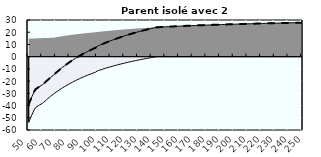
| Category | Coin fiscal moyen (somme des composantes) | Taux moyen d'imposition net en % du salaire brut |
|---|---|---|
| 50.0 | -38.941 | -38.941 |
| 51.0 | -36.217 | -36.217 |
| 52.0 | -33.598 | -33.598 |
| 53.0 | -31.077 | -31.077 |
| 54.0 | -28.65 | -28.65 |
| 55.0 | -26.685 | -26.685 |
| 56.0 | -25.896 | -25.896 |
| 57.0 | -25.134 | -25.134 |
| 58.0 | -24.399 | -24.399 |
| 59.0 | -23.689 | -23.689 |
| 60.0 | -23.003 | -23.003 |
| 61.0 | -22.114 | -22.114 |
| 62.0 | -21.039 | -21.039 |
| 63.0 | -19.999 | -19.999 |
| 64.0 | -18.991 | -18.991 |
| 65.0 | -18.014 | -18.014 |
| 66.0 | -17.067 | -17.067 |
| 67.0 | -16.148 | -16.148 |
| 68.0 | -15.256 | -15.256 |
| 69.0 | -14.209 | -14.209 |
| 70.0 | -13.192 | -13.192 |
| 71.0 | -12.203 | -12.203 |
| 72.0 | -11.242 | -11.242 |
| 73.0 | -10.307 | -10.307 |
| 74.0 | -9.398 | -9.398 |
| 75.0 | -8.513 | -8.513 |
| 76.0 | -7.651 | -7.651 |
| 77.0 | -6.811 | -6.811 |
| 78.0 | -5.993 | -5.993 |
| 79.0 | -5.195 | -5.195 |
| 80.0 | -4.418 | -4.418 |
| 81.0 | -3.66 | -3.66 |
| 82.0 | -2.92 | -2.92 |
| 83.0 | -2.198 | -2.198 |
| 84.0 | -1.493 | -1.493 |
| 85.0 | -0.805 | -0.805 |
| 86.0 | -0.133 | -0.133 |
| 87.0 | 0.524 | 0.524 |
| 88.0 | 1.165 | 1.165 |
| 89.0 | 1.793 | 1.793 |
| 90.0 | 2.406 | 2.406 |
| 91.0 | 3.006 | 3.006 |
| 92.0 | 3.593 | 3.593 |
| 93.0 | 4.167 | 4.167 |
| 94.0 | 4.729 | 4.729 |
| 95.0 | 5.28 | 5.28 |
| 96.0 | 5.818 | 5.818 |
| 97.0 | 6.346 | 6.346 |
| 98.0 | 6.863 | 6.863 |
| 99.0 | 7.369 | 7.369 |
| 100.0 | 8.386 | 8.386 |
| 101.0 | 8.897 | 8.897 |
| 102.0 | 9.398 | 9.398 |
| 103.0 | 9.89 | 9.89 |
| 104.0 | 10.372 | 10.372 |
| 105.0 | 10.844 | 10.844 |
| 106.0 | 11.308 | 11.308 |
| 107.0 | 11.763 | 11.763 |
| 108.0 | 12.21 | 12.21 |
| 109.0 | 12.648 | 12.648 |
| 110.0 | 13.079 | 13.079 |
| 111.0 | 13.501 | 13.501 |
| 112.0 | 13.916 | 13.916 |
| 113.0 | 14.324 | 14.324 |
| 114.0 | 14.725 | 14.725 |
| 115.0 | 15.119 | 15.119 |
| 116.0 | 15.506 | 15.506 |
| 117.0 | 15.886 | 15.886 |
| 118.0 | 16.26 | 16.26 |
| 119.0 | 16.627 | 16.627 |
| 120.0 | 16.989 | 16.989 |
| 121.0 | 17.344 | 17.344 |
| 122.0 | 17.694 | 17.694 |
| 123.0 | 18.038 | 18.038 |
| 124.0 | 18.376 | 18.376 |
| 125.0 | 18.709 | 18.709 |
| 126.0 | 19.037 | 19.037 |
| 127.0 | 19.359 | 19.359 |
| 128.0 | 19.677 | 19.677 |
| 129.0 | 19.989 | 19.989 |
| 130.0 | 20.297 | 20.297 |
| 131.0 | 20.6 | 20.6 |
| 132.0 | 20.899 | 20.899 |
| 133.0 | 21.193 | 21.193 |
| 134.0 | 21.482 | 21.482 |
| 135.0 | 21.768 | 21.768 |
| 136.0 | 22.049 | 22.049 |
| 137.0 | 22.326 | 22.326 |
| 138.0 | 22.599 | 22.599 |
| 139.0 | 22.868 | 22.868 |
| 140.0 | 23.133 | 23.133 |
| 141.0 | 23.395 | 23.395 |
| 142.0 | 23.652 | 23.652 |
| 143.0 | 23.907 | 23.907 |
| 144.0 | 24.067 | 24.067 |
| 145.0 | 24.129 | 24.129 |
| 146.0 | 24.189 | 24.189 |
| 147.0 | 24.249 | 24.249 |
| 148.0 | 24.309 | 24.309 |
| 149.0 | 24.367 | 24.367 |
| 150.0 | 24.424 | 24.424 |
| 151.0 | 24.481 | 24.481 |
| 152.0 | 24.537 | 24.537 |
| 153.0 | 24.593 | 24.593 |
| 154.0 | 24.647 | 24.647 |
| 155.0 | 24.701 | 24.701 |
| 156.0 | 24.754 | 24.754 |
| 157.0 | 24.807 | 24.807 |
| 158.0 | 24.859 | 24.859 |
| 159.0 | 24.91 | 24.91 |
| 160.0 | 24.96 | 24.96 |
| 161.0 | 25.01 | 25.01 |
| 162.0 | 25.06 | 25.06 |
| 163.0 | 25.108 | 25.108 |
| 164.0 | 25.156 | 25.156 |
| 165.0 | 25.204 | 25.204 |
| 166.0 | 25.251 | 25.251 |
| 167.0 | 25.297 | 25.297 |
| 168.0 | 25.343 | 25.343 |
| 169.0 | 25.389 | 25.389 |
| 170.0 | 25.433 | 25.433 |
| 171.0 | 25.478 | 25.478 |
| 172.0 | 25.521 | 25.521 |
| 173.0 | 25.565 | 25.565 |
| 174.0 | 25.607 | 25.607 |
| 175.0 | 25.649 | 25.649 |
| 176.0 | 25.691 | 25.691 |
| 177.0 | 25.733 | 25.733 |
| 178.0 | 25.773 | 25.773 |
| 179.0 | 25.814 | 25.814 |
| 180.0 | 25.854 | 25.854 |
| 181.0 | 25.893 | 25.893 |
| 182.0 | 25.932 | 25.932 |
| 183.0 | 25.971 | 25.971 |
| 184.0 | 26.009 | 26.009 |
| 185.0 | 26.047 | 26.047 |
| 186.0 | 26.084 | 26.084 |
| 187.0 | 26.121 | 26.121 |
| 188.0 | 26.158 | 26.158 |
| 189.0 | 26.194 | 26.194 |
| 190.0 | 26.23 | 26.23 |
| 191.0 | 26.265 | 26.265 |
| 192.0 | 26.3 | 26.3 |
| 193.0 | 26.335 | 26.335 |
| 194.0 | 26.369 | 26.369 |
| 195.0 | 26.403 | 26.403 |
| 196.0 | 26.437 | 26.437 |
| 197.0 | 26.47 | 26.47 |
| 198.0 | 26.503 | 26.503 |
| 199.0 | 26.536 | 26.536 |
| 200.0 | 26.568 | 26.568 |
| 201.0 | 26.6 | 26.6 |
| 202.0 | 26.632 | 26.632 |
| 203.0 | 26.663 | 26.663 |
| 204.0 | 26.694 | 26.694 |
| 205.0 | 26.725 | 26.725 |
| 206.0 | 26.756 | 26.756 |
| 207.0 | 26.786 | 26.786 |
| 208.0 | 26.816 | 26.816 |
| 209.0 | 26.845 | 26.845 |
| 210.0 | 26.875 | 26.875 |
| 211.0 | 26.904 | 26.904 |
| 212.0 | 26.932 | 26.932 |
| 213.0 | 26.961 | 26.961 |
| 214.0 | 26.989 | 26.989 |
| 215.0 | 27.017 | 27.017 |
| 216.0 | 27.045 | 27.045 |
| 217.0 | 27.072 | 27.072 |
| 218.0 | 27.099 | 27.099 |
| 219.0 | 27.126 | 27.126 |
| 220.0 | 27.153 | 27.153 |
| 221.0 | 27.179 | 27.179 |
| 222.0 | 27.206 | 27.206 |
| 223.0 | 27.232 | 27.232 |
| 224.0 | 27.257 | 27.257 |
| 225.0 | 27.283 | 27.283 |
| 226.0 | 27.308 | 27.308 |
| 227.0 | 27.333 | 27.333 |
| 228.0 | 27.358 | 27.358 |
| 229.0 | 27.383 | 27.383 |
| 230.0 | 27.407 | 27.407 |
| 231.0 | 27.431 | 27.431 |
| 232.0 | 27.455 | 27.455 |
| 233.0 | 27.479 | 27.479 |
| 234.0 | 27.503 | 27.503 |
| 235.0 | 27.526 | 27.526 |
| 236.0 | 27.549 | 27.549 |
| 237.0 | 27.572 | 27.572 |
| 238.0 | 27.595 | 27.595 |
| 239.0 | 27.618 | 27.618 |
| 240.0 | 27.64 | 27.64 |
| 241.0 | 27.662 | 27.662 |
| 242.0 | 27.685 | 27.685 |
| 243.0 | 27.706 | 27.706 |
| 244.0 | 27.728 | 27.728 |
| 245.0 | 27.75 | 27.75 |
| 246.0 | 27.771 | 27.771 |
| 247.0 | 27.792 | 27.792 |
| 248.0 | 27.813 | 27.813 |
| 249.0 | 27.834 | 27.834 |
| 250.0 | 27.855 | 27.855 |